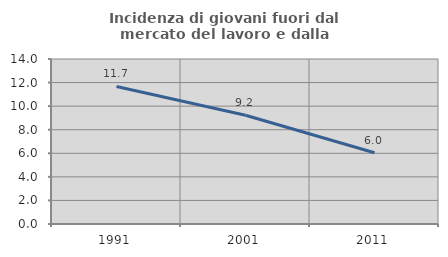
| Category | Incidenza di giovani fuori dal mercato del lavoro e dalla formazione  |
|---|---|
| 1991.0 | 11.672 |
| 2001.0 | 9.231 |
| 2011.0 | 6.04 |